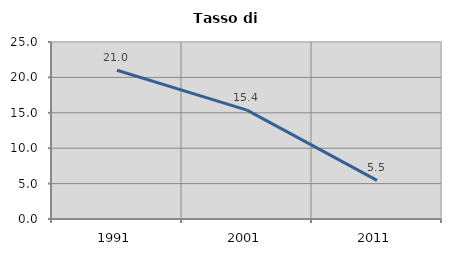
| Category | Tasso di disoccupazione   |
|---|---|
| 1991.0 | 21.014 |
| 2001.0 | 15.385 |
| 2011.0 | 5.461 |